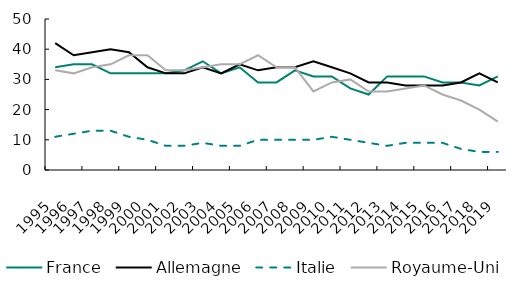
| Category | France | Allemagne | Italie | Royaume-Uni |
|---|---|---|---|---|
| 1995.0 | 34 | 42 | 11 | 33 |
| 1996.0 | 35 | 38 | 12 | 32 |
| 1997.0 | 35 | 39 | 13 | 34 |
| 1998.0 | 32 | 40 | 13 | 35 |
| 1999.0 | 32 | 39 | 11 | 38 |
| 2000.0 | 32 | 34 | 10 | 38 |
| 2001.0 | 32 | 32 | 8 | 33 |
| 2002.0 | 33 | 32 | 8 | 33 |
| 2003.0 | 36 | 34 | 9 | 34 |
| 2004.0 | 32 | 32 | 8 | 35 |
| 2005.0 | 34 | 35 | 8 | 35 |
| 2006.0 | 29 | 33 | 10 | 38 |
| 2007.0 | 29 | 34 | 10 | 34 |
| 2008.0 | 33 | 34 | 10 | 34 |
| 2009.0 | 31 | 36 | 10 | 26 |
| 2010.0 | 31 | 34 | 11 | 29 |
| 2011.0 | 27 | 32 | 10 | 30 |
| 2012.0 | 25 | 29 | 9 | 26 |
| 2013.0 | 31 | 29 | 8 | 26 |
| 2014.0 | 31 | 28 | 9 | 27 |
| 2015.0 | 31 | 28 | 9 | 28 |
| 2016.0 | 29 | 28 | 9 | 25 |
| 2017.0 | 29 | 29 | 7 | 23 |
| 2018.0 | 28 | 32 | 6 | 20 |
| 2019.0 | 31 | 29 | 6 | 16 |